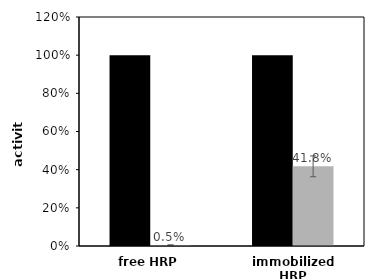
| Category | Series 0 | Series 1 |
|---|---|---|
| free HRP | 1 | 0.005 |
| immobilized HRP | 1 | 0.418 |